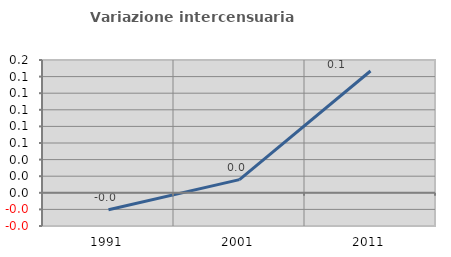
| Category | Variazione intercensuaria annua |
|---|---|
| 1991.0 | -0.02 |
| 2001.0 | 0.016 |
| 2011.0 | 0.147 |